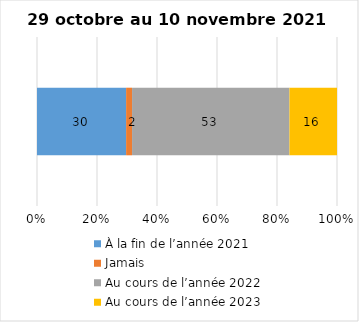
| Category | À la fin de l’année 2021 | Jamais | Au cours de l’année 2022 | Au cours de l’année 2023 |
|---|---|---|---|---|
| 0 | 30 | 2 | 53 | 16 |